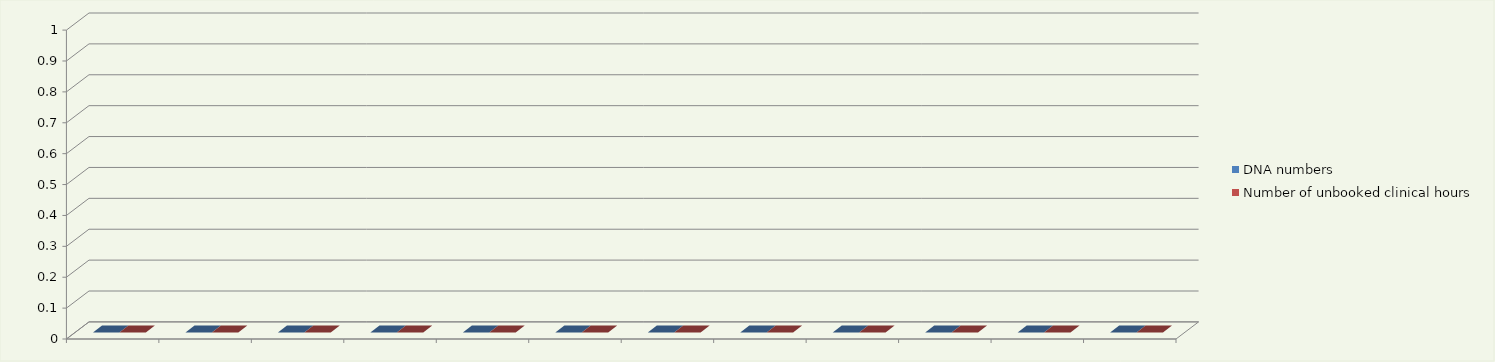
| Category | DNA numbers | Number of unbooked clinical hours |
|---|---|---|
| 0 | 0 | 0 |
| 1 | 0 | 0 |
| 2 | 0 | 0 |
| 3 | 0 | 0 |
| 4 | 0 | 0 |
| 5 | 0 | 0 |
| 6 | 0 | 0 |
| 7 | 0 | 0 |
| 8 | 0 | 0 |
| 9 | 0 | 0 |
| 10 | 0 | 0 |
| 11 | 0 | 0 |